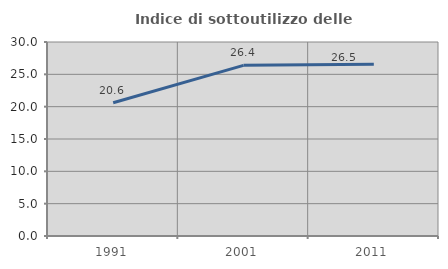
| Category | Indice di sottoutilizzo delle abitazioni  |
|---|---|
| 1991.0 | 20.612 |
| 2001.0 | 26.392 |
| 2011.0 | 26.54 |